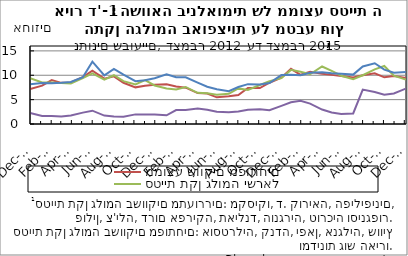
| Category | ממוצע שווקים מפותחים | סטיית תקן גלומה ישראל | ממוצע שווקים מתעוררים | סטיית תקן גלומה סין |
|---|---|---|---|---|
| 2012-12-26 | 7.182 | 9.4 | 8.153 | 2.262 |
| 2013-01-30 | 7.859 | 8.5 | 8.386 | 1.63 |
| 2013-02-27 | 8.998 | 8.5 | 8.368 | 1.655 |
| 2013-03-27 | 8.442 | 8.4 | 8.465 | 1.538 |
| 2013-04-24 | 8.514 | 8.3 | 8.62 | 1.725 |
| 2013-05-29 | 9.603 | 9.4 | 9.591 | 2.335 |
| 2013-06-26 | 10.924 | 10.4 | 12.778 | 2.732 |
| 2013-07-31 | 9.3 | 9.1 | 9.963 | 1.722 |
| 2013-08-28 | 9.774 | 10 | 11.279 | 1.562 |
| 2013-09-25 | 8.465 | 8.8 | 10.115 | 1.51 |
| 2013-10-30 | 7.519 | 8.1 | 8.785 | 1.972 |
| 2013-11-27 | 7.866 | 9 | 8.977 | 1.965 |
| 2013-12-25 | 8.066 | 7.9 | 9.4 | 1.965 |
| 2014-01-29 | 8.158 | 7.3 | 10.212 | 1.788 |
| 2014-02-26 | 7.693 | 7.1 | 9.575 | 2.865 |
| 2014-03-26 | 7.458 | 7.6 | 9.572 | 2.87 |
| 2014-04-30 | 6.345 | 6.4 | 8.474 | 3.158 |
| 2014-05-28 | 6.234 | 6.3 | 7.636 | 2.902 |
| 2014-06-25 | 5.473 | 6 | 7.13 | 2.51 |
| 2014-07-30 | 5.672 | 6.2 | 6.719 | 2.432 |
| 2014-08-27 | 5.94 | 7.3 | 7.577 | 2.542 |
| 2014-09-24 | 7.4 | 7 | 8.174 | 2.932 |
| 2014-10-29 | 7.382 | 8 | 8.109 | 3.02 |
| 2014-11-26 | 8.467 | 8.8 | 8.387 | 2.818 |
| 2014-12-31 | 9.49 | 9.4 | 10.036 | 3.725 |
| 2015-01-28 | 11.313 | 11.1 | 10.11 | 4.45 |
| 2015-02-25 | 10.092 | 10.7 | 9.982 | 4.77 |
| 2015-03-25 | 10.724 | 10.2 | 10.522 | 4.172 |
| 2015-04-29 | 10.311 | 11.8 | 10.621 | 2.96 |
| 2015-05-27 | 10.078 | 10.9 | 10.387 | 2.36 |
| 2015-06-24 | 9.825 | 9.9 | 10.325 | 2.06 |
| 2015-07-29 | 9.556 | 9.2 | 10.131 | 2.16 |
| 2015-08-26 | 9.983 | 10 | 11.807 | 7.048 |
| 2015-09-30 | 10.388 | 11.2 | 12.454 | 6.548 |
| 2015-10-28 | 9.572 | 11.9 | 11.15 | 6.015 |
| 2015-11-25 | 9.838 | 9.9 | 10.528 | 6.272 |
| 2015-12-30 | 9.462 | 9.1 | 10.652 | 7.26 |